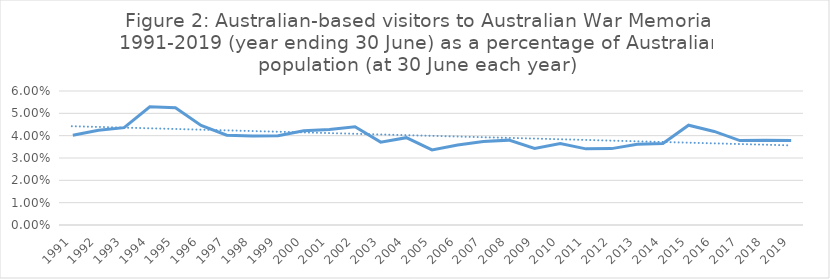
| Category | Series 0 |
|---|---|
| 1991.0 | 0.04 |
| 1992.0 | 0.042 |
| 1993.0 | 0.044 |
| 1994.0 | 0.053 |
| 1995.0 | 0.052 |
| 1996.0 | 0.045 |
| 1997.0 | 0.04 |
| 1998.0 | 0.04 |
| 1999.0 | 0.04 |
| 2000.0 | 0.042 |
| 2001.0 | 0.043 |
| 2002.0 | 0.044 |
| 2003.0 | 0.037 |
| 2004.0 | 0.039 |
| 2005.0 | 0.034 |
| 2006.0 | 0.036 |
| 2007.0 | 0.037 |
| 2008.0 | 0.038 |
| 2009.0 | 0.034 |
| 2010.0 | 0.036 |
| 2011.0 | 0.034 |
| 2012.0 | 0.034 |
| 2013.0 | 0.036 |
| 2014.0 | 0.036 |
| 2015.0 | 0.045 |
| 2016.0 | 0.042 |
| 2017.0 | 0.038 |
| 2018.0 | 0.038 |
| 2019.0 | 0.038 |